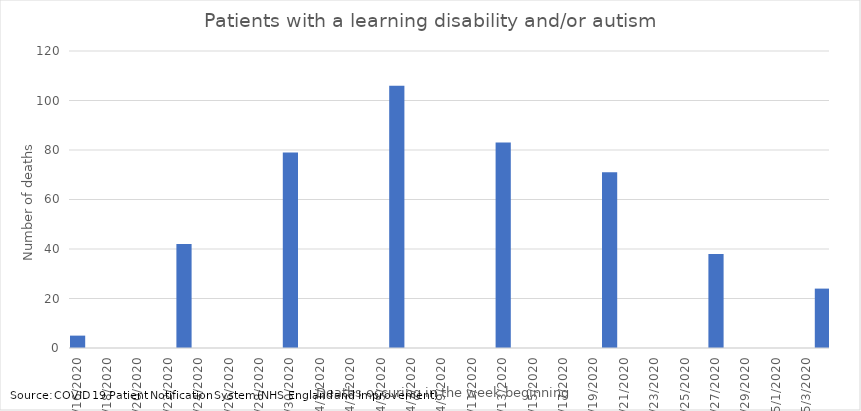
| Category | Number of cases |
|---|---|
| 3/16/20 | 5 |
| 3/23/20 | 42 |
| 3/30/20 | 79 |
| 4/6/20 | 106 |
| 4/13/20 | 83 |
| 4/20/20 | 71 |
| 4/27/20 | 38 |
| 5/4/20 | 24 |